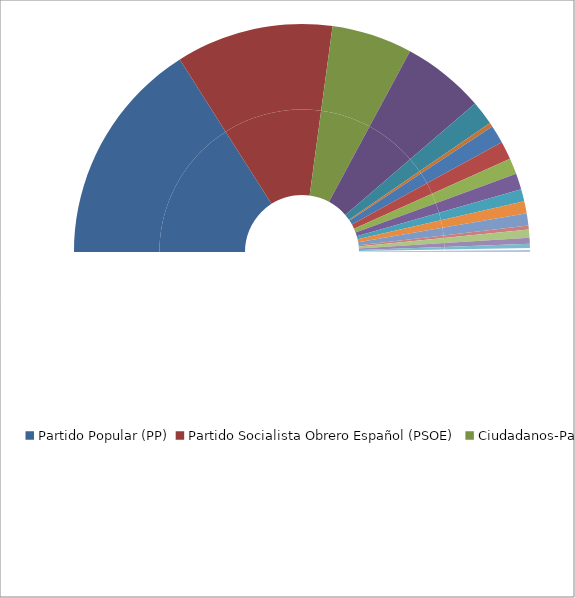
| Category | Series 0 | Series 1 |
|---|---|---|
| Partido Popular (PP) | 112 | 32 |
| Partido Socialista Obrero Español (PSOE) | 78 | 22.286 |
| Ciudadanos-Partido de la Ciudadanía (C's) | 40 | 11.429 |
| Podemos  | 41 | 11.714 |
| Coalición "En Comú Podem" (EN COMÚ) | 12 | 3.429 |
| Coalición "Unidad Popular" | 2 | 0.571 |
| Coalición "Compromís-Podemos-És el Moment" (PODEMOS-COMPROMÍS)  | 9 | 2.571 |
| Coalición "Esquerra Republicana de Catalunya-Catalunya Sí" (ERC-CATSI) | 9 | 2.571 |
| Partit dels Socialistes de Catalunya (PSC-PSOE) (PSC) | 8 | 2.286 |
| Coalición "Democràcia i Llibertat. Convergéncia. Demòcrates. Reagrupament" (DL)
 | 8 | 2.286 |
| Coalición "En Marea" (PODEMOS-En Marea-ANOVA-EU) | 6 | 1.714 |
| Euzko Alderdi Jetzalea-Partido Nacionalista Vasco (EAJ-PNV) | 6 | 1.714 |
| Coalición "Partido Popular en coalición con el Partido Aragonés" (PP-PAR) | 6 | 1.714 |
| Euskal Herria Bildu (EH Bildu) | 2 | 0.571 |
| Coalición "Partido Socialista Obrero Español-Nueva Canarias" (PSOE-NCa) | 4 | 1.143 |
| Coalición "Partido Popular-Foro" (PP-FORO) | 3 | 0.857 |
| Coalición "Unión del Pueblo Navarro-Partido Popular" (UPN-PP) | 2 | 0.571 |
| Coalición Canaria-Partido Nacionalista Canario (CCa-PNC) | 1 | 0.286 |
| Coalición "Podemos-Ahora Alto Aragón en Común" | 1 | 0.286 |